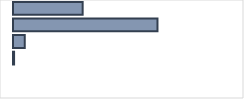
| Category | Series 0 |
|---|---|
| 0 | 30.685 |
| 1 | 63.646 |
| 2 | 5.195 |
| 3 | 0.474 |
| 4 | 0 |